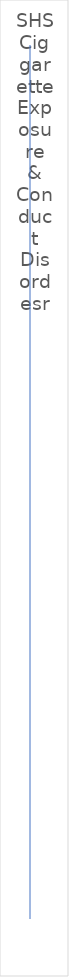
| Category | OR |
|---|---|
| 1.85 | 1 |